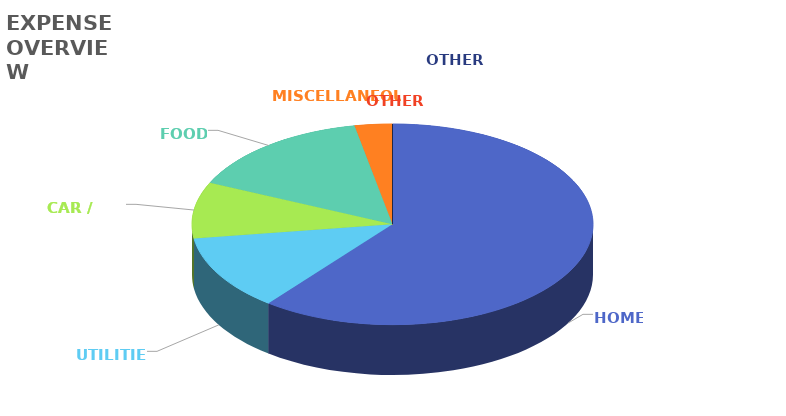
| Category | Series 0 |
|---|---|
| HOME | 2000 |
| UTILITIES | 400 |
| CAR / TRANSIT | 300 |
| FOOD | 500 |
| MISCELLANEOUS | 100 |
| OTHER 1 | 0 |
| OTHER 2 | 0 |